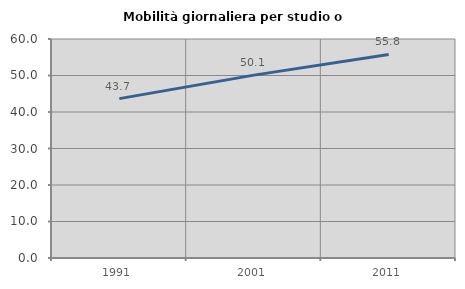
| Category | Mobilità giornaliera per studio o lavoro |
|---|---|
| 1991.0 | 43.665 |
| 2001.0 | 50.098 |
| 2011.0 | 55.771 |